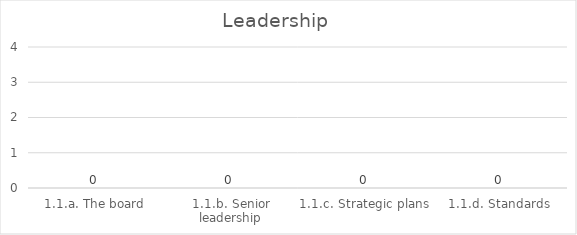
| Category | Leadership |
|---|---|
| 1.1.a. The board | 0 |
| 1.1.b. Senior leadership | 0 |
| 1.1.c. Strategic plans | 0 |
| 1.1.d. Standards | 0 |